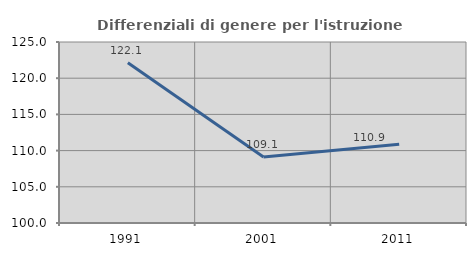
| Category | Differenziali di genere per l'istruzione superiore |
|---|---|
| 1991.0 | 122.142 |
| 2001.0 | 109.106 |
| 2011.0 | 110.883 |